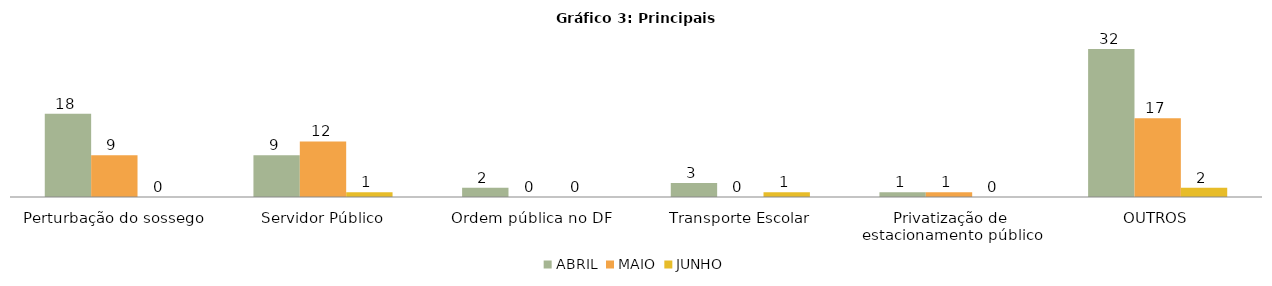
| Category | ABRIL | MAIO | JUNHO |
|---|---|---|---|
| Perturbação do sossego | 18 | 9 | 0 |
| Servidor Público | 9 | 12 | 1 |
| Ordem pública no DF | 2 | 0 | 0 |
| Transporte Escolar | 3 | 0 | 1 |
| Privatização de estacionamento público | 1 | 1 | 0 |
| OUTROS | 32 | 17 | 2 |